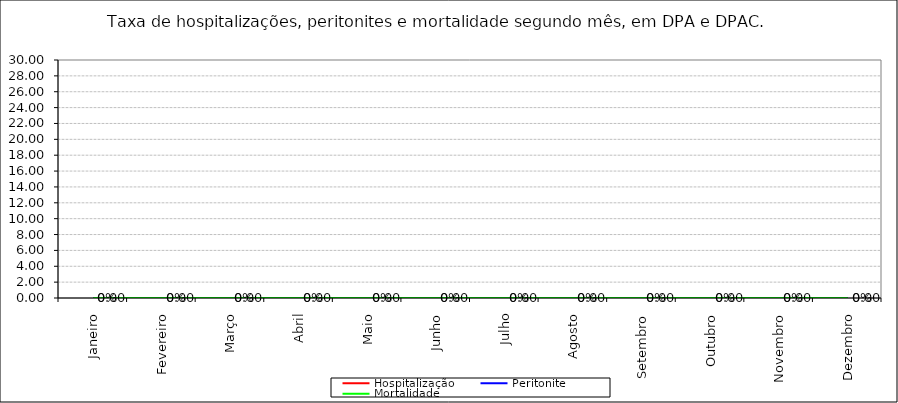
| Category | Hospitalização | Peritonite | Mortalidade |
|---|---|---|---|
| Janeiro | 0 | 0 | 0 |
| Fevereiro | 0 | 0 | 0 |
| Março | 0 | 0 | 0 |
| Abril | 0 | 0 | 0 |
| Maio | 0 | 0 | 0 |
| Junho | 0 | 0 | 0 |
| Julho | 0 | 0 | 0 |
| Agosto | 0 | 0 | 0 |
| Setembro | 0 | 0 | 0 |
| Outubro | 0 | 0 | 0 |
| Novembro | 0 | 0 | 0 |
| Dezembro | 0 | 0 | 0 |